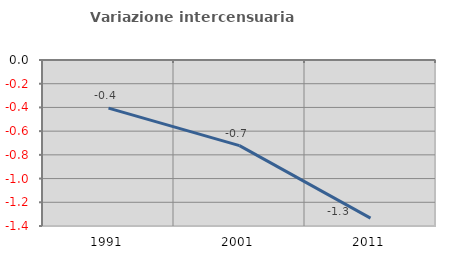
| Category | Variazione intercensuaria annua |
|---|---|
| 1991.0 | -0.406 |
| 2001.0 | -0.722 |
| 2011.0 | -1.333 |